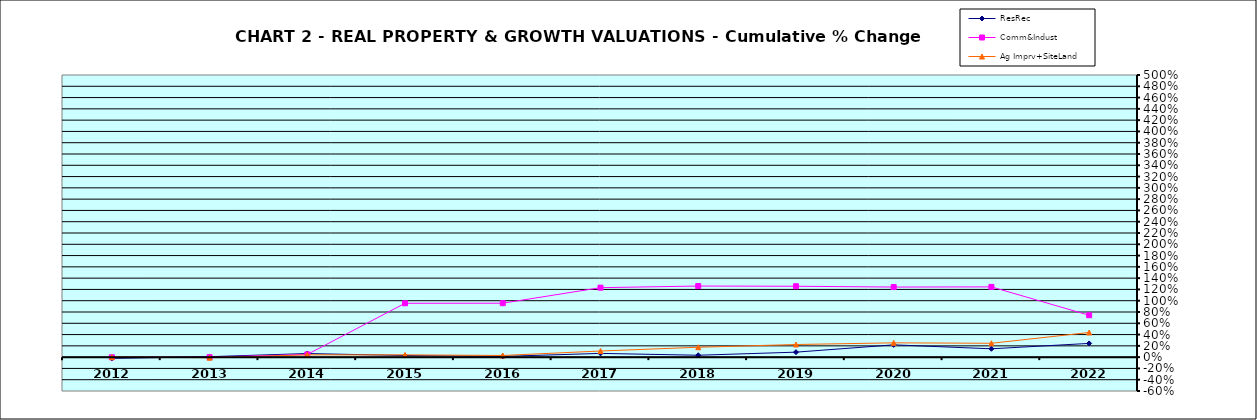
| Category | ResRec | Comm&Indust | Ag Imprv+SiteLand |
|---|---|---|---|
| 2012.0 | -0.022 | -0.002 | 0 |
| 2013.0 | 0.008 | -0.001 | -0.009 |
| 2014.0 | 0.064 | 0.048 | 0.041 |
| 2015.0 | 0.029 | 0.954 | 0.04 |
| 2016.0 | 0.013 | 0.956 | 0.029 |
| 2017.0 | 0.066 | 1.231 | 0.109 |
| 2018.0 | 0.034 | 1.26 | 0.175 |
| 2019.0 | 0.088 | 1.256 | 0.224 |
| 2020.0 | 0.218 | 1.242 | 0.253 |
| 2021.0 | 0.148 | 1.245 | 0.246 |
| 2022.0 | 0.243 | 0.742 | 0.437 |